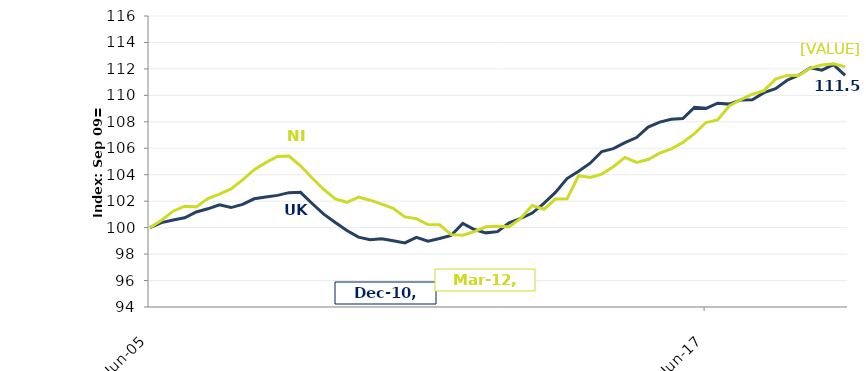
| Category | UK |
|---|---|
| 2005-06-01 | 100 |
| 2005-09-01 | 100.38 |
| 2005-12-01 | 100.572 |
| 2006-03-01 | 100.742 |
| 2006-06-01 | 101.184 |
| 2006-09-01 | 101.423 |
| 2006-12-01 | 101.723 |
| 2007-03-01 | 101.517 |
| 2007-06-01 | 101.759 |
| 2007-09-01 | 102.179 |
| 2007-12-01 | 102.324 |
| 2008-03-01 | 102.44 |
| 2008-06-01 | 102.646 |
| 2008-09-01 | 102.671 |
| 2008-12-01 | 101.828 |
| 2009-03-01 | 101.021 |
| 2009-06-01 | 100.384 |
| 2009-09-01 | 99.779 |
| 2009-12-01 | 99.283 |
| 2010-03-01 | 99.084 |
| 2010-06-01 | 99.157 |
| 2010-09-01 | 99.001 |
| 2010-12-01 | 98.845 |
| 2011-03-01 | 99.269 |
| 2011-06-01 | 98.976 |
| 2011-09-01 | 99.182 |
| 2011-12-01 | 99.41 |
| 2012-03-01 | 100.322 |
| 2012-06-01 | 99.855 |
| 2012-09-01 | 99.605 |
| 2012-12-01 | 99.696 |
| 2013-03-01 | 100.358 |
| 2013-06-01 | 100.691 |
| 2013-09-01 | 101.1 |
| 2013-12-01 | 101.839 |
| 2014-03-01 | 102.664 |
| 2014-06-01 | 103.71 |
| 2014-09-01 | 104.271 |
| 2014-12-01 | 104.872 |
| 2015-03-01 | 105.755 |
| 2015-06-01 | 105.969 |
| 2015-09-01 | 106.425 |
| 2015-12-01 | 106.809 |
| 2016-03-01 | 107.605 |
| 2016-06-01 | 107.974 |
| 2016-09-01 | 108.195 |
| 2016-12-01 | 108.253 |
| 2017-03-01 | 109.089 |
| 2017-06-01 | 109.017 |
| 2017-09-01 | 109.408 |
| 2017-12-01 | 109.339 |
| 2018-03-01 | 109.654 |
| 2018-06-01 | 109.661 |
| 2018-09-01 | 110.201 |
| 2018-12-01 | 110.512 |
| 2019-03-01 | 111.145 |
| 2019-06-01 | 111.525 |
| 2019-09-01 | 112.086 |
| 2019-12-01 | 111.909 |
| 2020-03-01 | 112.329 |
| 2020-06-01 | 111.507 |